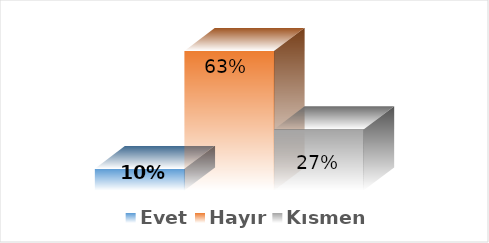
| Category | Evet | Hayır | Kısmen |
|---|---|---|---|
| 0 | 0.098 | 0.627 | 0.275 |